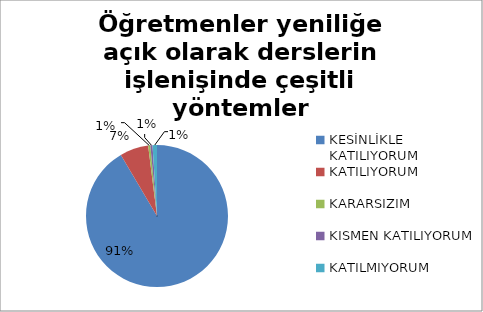
| Category | Öğretmenler yeniliğe açık olarak derslerin işlenişinde çeşitli yöntemler kullanmaktadır. |
|---|---|
| KESİNLİKLE KATILIYORUM | 183 |
| KATILIYORUM | 13 |
| KARARSIZIM | 1 |
| KISMEN KATILIYORUM | 1 |
| KATILMIYORUM | 2 |